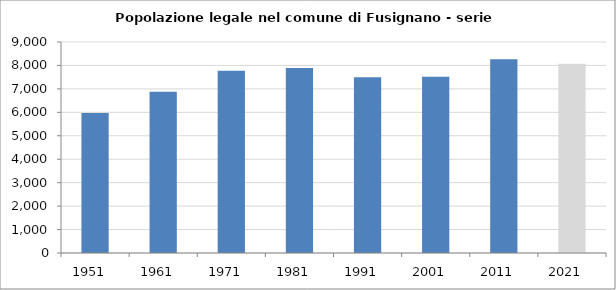
| Category | Popolazione residente |
|---|---|
| 1951   | 5975 |
| 1961   | 6879 |
| 1971   | 7771 |
| 1981   | 7892 |
| 1991   | 7494 |
| 2001   | 7516 |
| 2011   | 8259 |
| 2021   | 8075 |